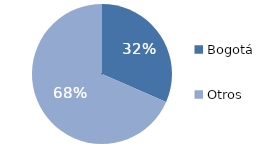
| Category | Series 0 |
|---|---|
| Bogotá | 31.557 |
| Otros | 68.443 |